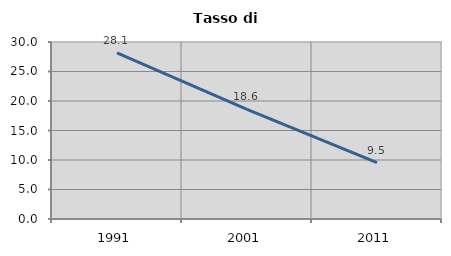
| Category | Tasso di disoccupazione   |
|---|---|
| 1991.0 | 28.142 |
| 2001.0 | 18.59 |
| 2011.0 | 9.537 |